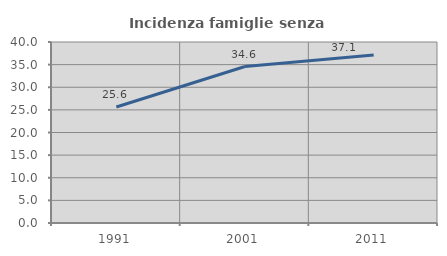
| Category | Incidenza famiglie senza nuclei |
|---|---|
| 1991.0 | 25.647 |
| 2001.0 | 34.583 |
| 2011.0 | 37.131 |